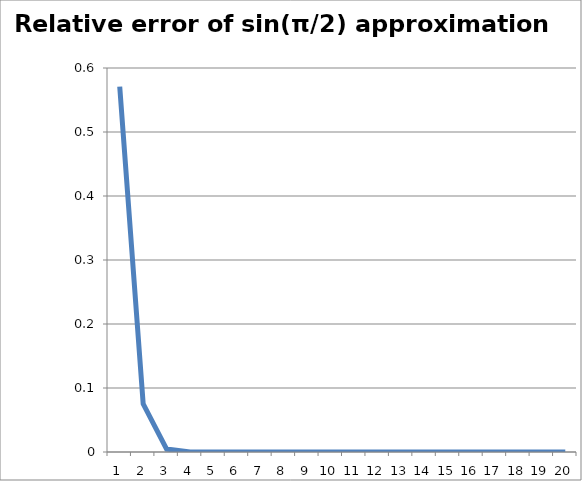
| Category | sin(π/2) approximation |
|---|---|
| 1.0 | 0.571 |
| 2.0 | 0.075 |
| 3.0 | 0.005 |
| 4.0 | 0 |
| 5.0 | 0 |
| 6.0 | 0 |
| 7.0 | 0 |
| 8.0 | 0 |
| 9.0 | 0 |
| 10.0 | 0 |
| 11.0 | 0 |
| 12.0 | 0 |
| 13.0 | 0 |
| 14.0 | 0 |
| 15.0 | 0 |
| 16.0 | 0 |
| 17.0 | 0 |
| 18.0 | 0 |
| 19.0 | 0 |
| 20.0 | 0 |